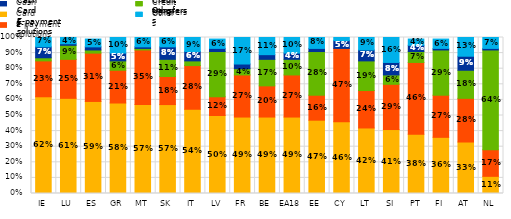
| Category | Cards | E-payment solutions | Credit transfers | Cash  | Others |
|---|---|---|---|---|---|
| IE | 0.62 | 0.23 | 0.02 | 0.07 | 0.07 |
| LU | 0.61 | 0.25 | 0.09 | 0.01 | 0.04 |
| ES | 0.59 | 0.31 | 0.02 | 0.02 | 0.05 |
| GR | 0.58 | 0.21 | 0.06 | 0.05 | 0.1 |
| MT | 0.57 | 0.35 | 0.01 | 0.01 | 0.06 |
| SK | 0.57 | 0.18 | 0.11 | 0.08 | 0.06 |
| IT | 0.54 | 0.28 | 0.03 | 0.06 | 0.09 |
| LV | 0.5 | 0.12 | 0.29 | 0.02 | 0.06 |
| FR | 0.49 | 0.27 | 0.04 | 0.03 | 0.17 |
| BE | 0.49 | 0.2 | 0.17 | 0.03 | 0.11 |
| EA18 | 0.49 | 0.27 | 0.1 | 0.04 | 0.1 |
| EE | 0.47 | 0.16 | 0.28 | 0.02 | 0.08 |
| CY | 0.46 | 0.47 | 0 | 0.05 | 0.03 |
| LT | 0.42 | 0.24 | 0.19 | 0.07 | 0.09 |
| SI | 0.41 | 0.29 | 0.06 | 0.08 | 0.16 |
| PT | 0.38 | 0.46 | 0.07 | 0.04 | 0.04 |
| FI | 0.36 | 0.27 | 0.29 | 0.01 | 0.06 |
| AT | 0.33 | 0.28 | 0.18 | 0.09 | 0.13 |
| NL | 0.11 | 0.17 | 0.64 | 0.01 | 0.07 |